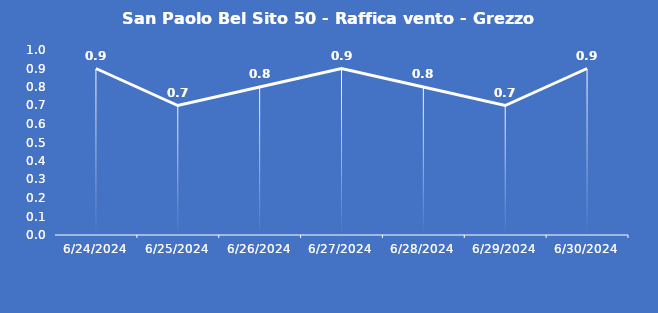
| Category | San Paolo Bel Sito 50 - Raffica vento - Grezzo (m/s) |
|---|---|
| 6/24/24 | 0.9 |
| 6/25/24 | 0.7 |
| 6/26/24 | 0.8 |
| 6/27/24 | 0.9 |
| 6/28/24 | 0.8 |
| 6/29/24 | 0.7 |
| 6/30/24 | 0.9 |